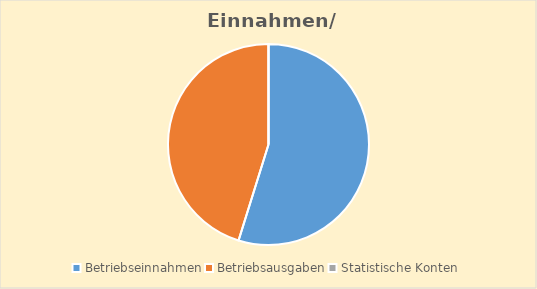
| Category | Series 0 |
|---|---|
| Betriebseinnahmen | 4266.9 |
| Betriebsausgaben | 3517.17 |
| Statistische Konten | 0 |